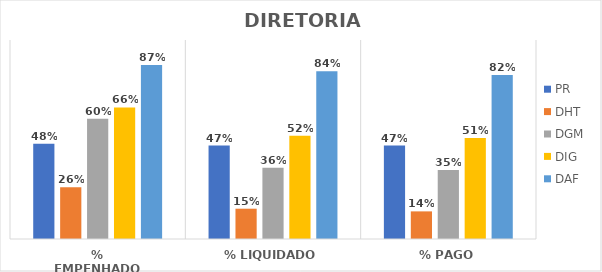
| Category | PR | DHT | DGM | DIG | DAF |
|---|---|---|---|---|---|
| % EMPENHADO | 0.479 | 0.26 | 0.604 | 0.661 | 0.875 |
| % LIQUIDADO | 0.47 | 0.152 | 0.358 | 0.519 | 0.843 |
| % PAGO | 0.47 | 0.139 | 0.347 | 0.507 | 0.825 |